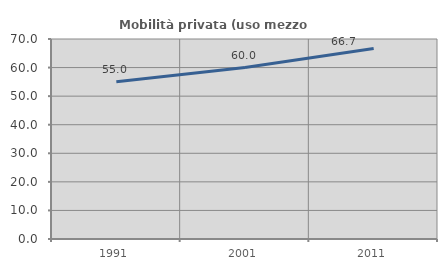
| Category | Mobilità privata (uso mezzo privato) |
|---|---|
| 1991.0 | 55 |
| 2001.0 | 60 |
| 2011.0 | 66.667 |